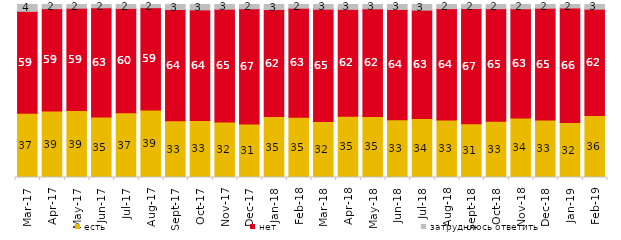
| Category | есть | нет | затрудняюсь ответить |
|---|---|---|---|
| 2017-03-01 | 37.2 | 58.85 | 3.95 |
| 2017-04-01 | 38.5 | 59.1 | 2.4 |
| 2017-05-01 | 38.7 | 59.15 | 2.15 |
| 2017-06-01 | 34.95 | 63.15 | 1.9 |
| 2017-07-01 | 37.4 | 60.35 | 2.25 |
| 2017-08-01 | 39 | 59.15 | 1.85 |
| 2017-09-01 | 32.8 | 64.3 | 2.9 |
| 2017-10-01 | 33 | 63.9 | 3.1 |
| 2017-11-01 | 32.1 | 65.15 | 2.7 |
| 2017-12-01 | 30.95 | 66.6 | 2.45 |
| 2018-01-01 | 35.2 | 61.9 | 2.9 |
| 2018-02-01 | 34.8 | 63.05 | 2.15 |
| 2018-03-01 | 32.35 | 64.95 | 2.7 |
| 2018-04-01 | 35.45 | 61.75 | 2.8 |
| 2018-05-01 | 35.3 | 62.15 | 2.5 |
| 2018-06-01 | 33.45 | 63.7 | 2.85 |
| 2018-07-01 | 34.05 | 62.7 | 3.25 |
| 2018-08-01 | 33.3 | 64.3 | 2.4 |
| 2018-09-01 | 31 | 66.7 | 2.3 |
| 2018-10-01 | 32.55 | 65.05 | 2.4 |
| 2018-11-01 | 34.431 | 63.124 | 2.445 |
| 2018-12-01 | 33.25 | 64.6 | 2.15 |
| 2019-01-01 | 31.75 | 66.25 | 2 |
| 2019-02-01 | 35.8 | 61.5 | 2.7 |